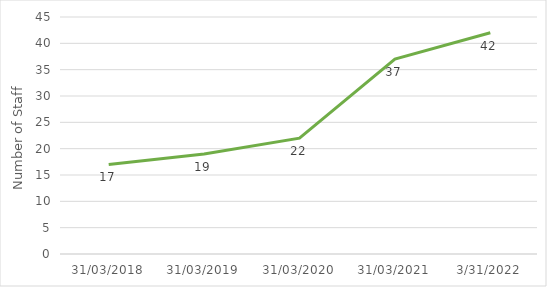
| Category | Total |
|---|---|
| 31/03/2018 | 17 |
| 31/03/2019 | 19 |
| 31/03/2020 | 22 |
| 31/03/2021 | 37 |
| 31/03/2022 | 42 |